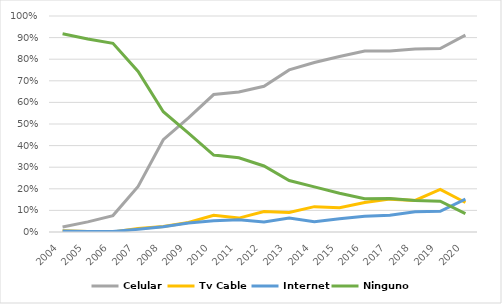
| Category | Celular | Tv Cable | Internet | Ninguno |
|---|---|---|---|---|
| 2004.0 | 0.023 | 0.006 | 0.004 | 0.918 |
| 2005.0 | 0.047 | 0.002 | 0.003 | 0.894 |
| 2006.0 | 0.076 | 0 | 0.003 | 0.874 |
| 2007.0 | 0.211 | 0.017 | 0.012 | 0.743 |
| 2008.0 | 0.427 | 0.025 | 0.025 | 0.557 |
| 2009.0 | 0.528 | 0.044 | 0.042 | 0.457 |
| 2010.0 | 0.636 | 0.078 | 0.052 | 0.356 |
| 2011.0 | 0.648 | 0.064 | 0.056 | 0.343 |
| 2012.0 | 0.674 | 0.094 | 0.046 | 0.306 |
| 2013.0 | 0.75 | 0.091 | 0.065 | 0.238 |
| 2014.0 | 0.785 | 0.117 | 0.048 | 0.209 |
| 2015.0 | 0.812 | 0.113 | 0.061 | 0.179 |
| 2016.0 | 0.838 | 0.137 | 0.073 | 0.154 |
| 2017.0 | 0.838 | 0.152 | 0.078 | 0.155 |
| 2018.0 | 0.848 | 0.146 | 0.093 | 0.146 |
| 2019.0 | 0.85 | 0.197 | 0.096 | 0.142 |
| 2020.0 | 0.911 | 0.137 | 0.153 | 0.085 |